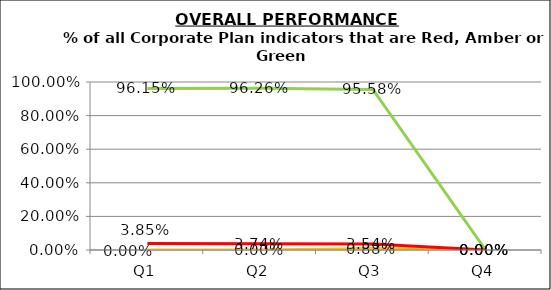
| Category | Green | Amber | Red |
|---|---|---|---|
| Q1 | 0.962 | 0 | 0.038 |
| Q2 | 0.963 | 0 | 0.037 |
| Q3 | 0.956 | 0.009 | 0.035 |
| Q4 | 0 | 0 | 0 |